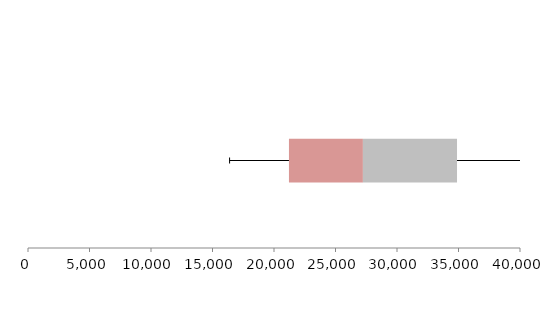
| Category | Series 1 | Series 2 | Series 3 |
|---|---|---|---|
| 0 | 21216.424 | 6011.863 | 7651.321 |